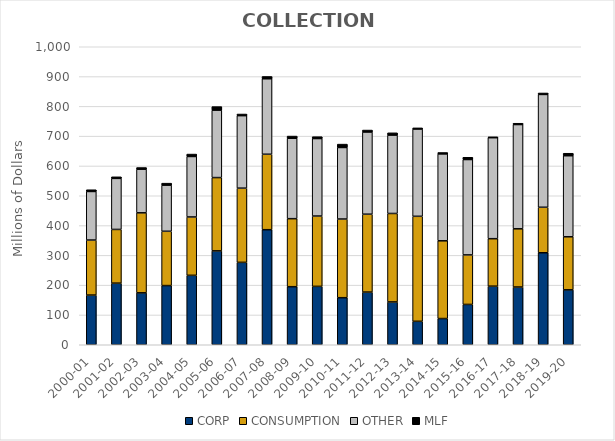
| Category | CORP | CONSUMPTION | OTHER | MLF |
|---|---|---|---|---|
| 2000-01 | 166.7 | 184.7 | 163 | 5.8 |
| 2001-02 | 206.7 | 180.3 | 171.3 | 5.3 |
| 2002-03 | 174.2 | 268.5 | 146.4 | 5.6 |
| 2003-04 | 198.6 | 182.2 | 154.9 | 6.6 |
| 2004-05 | 233 | 195.8 | 203 | 8.1 |
| 2005-06 | 315 | 246 | 226.4 | 11.8 |
| 2006-07 | 276.5 | 249 | 243.3 | 5.5 |
| 2007-08 | 386.1 | 253.2 | 253.3 | 7.7 |
| 2008-09 | 194.8 | 228.3 | 269.9 | 7.3 |
| 2009-10 | 195.9 | 236 | 260.1 | 6.2 |
| 2010-11 | 157.9 | 264 | 240.1 | 11.299 |
| 2011-12 | 176.7 | 261.4 | 275.9 | 6.5 |
| 2012-13 | 143.7 | 296.8 | 263.2 | 7.5 |
| 2013-14 | 78.7 | 352.3 | 293 | 3.793 |
| 2014-15 | 87.973 | 260.817 | 291.667 | 4.7 |
| 2015-16 | 135.298 | 166.143 | 320.107 | 7.6 |
| 2016-17 | 196.577 | 159.365 | 338.852 | 2.9 |
| 2017-18 | 193.688 | 195.403 | 349.863 | 4.42 |
| 2018-19 | 308.7 | 152.7 | 378.6 | 4.9 |
| 2019-20 | 184.3 | 178 | 272 | 8.4 |